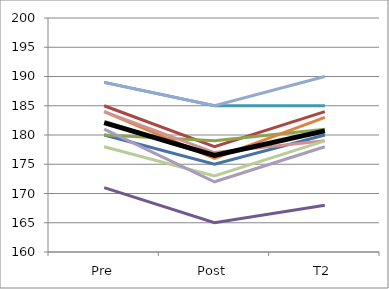
| Category | Series 0 | Series 1 | Series 2 | Series 3 | Series 4 | Series 5 | Series 6 | Series 7 | Series 8 | Series 9 | Mean |
|---|---|---|---|---|---|---|---|---|---|---|---|
| Pre | 180 | 185 | 180 | 171 | 189 | 184 | 189 | 184 | 178 | 181 | 182.1 |
| Post | 175 | 178 | 179 | 165 | 185 | 176 | 185 | 177 | 173 | 172 | 176.5 |
| T2 | 180 | 184 | 181 | 168 | 185 | 183 | 190 | 179 | 179 | 178 | 180.7 |